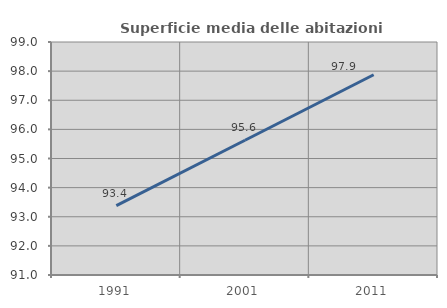
| Category | Superficie media delle abitazioni occupate |
|---|---|
| 1991.0 | 93.383 |
| 2001.0 | 95.627 |
| 2011.0 | 97.877 |